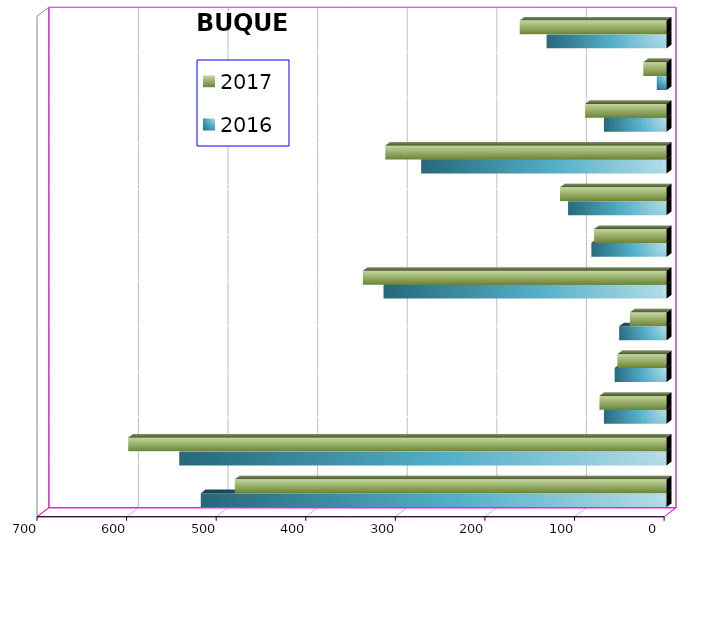
| Category | 2016 | 2017 |
|---|---|---|
| ICAVE | 520 | 482 |
| CICE | 544 | 601 |
| T. C. E. | 70 | 75 |
| CARGILL | 58 | 55 |
| TMV | 53 | 41 |
| SSA | 316 | 339 |
| SEPSA | 84 | 81 |
| VOPAK | 110 | 119 |
| CPV | 274 | 314 |
| EXCELLENCE | 70 | 91 |
| SIP | 11 | 26 |
| PEMEX | 134 | 164 |